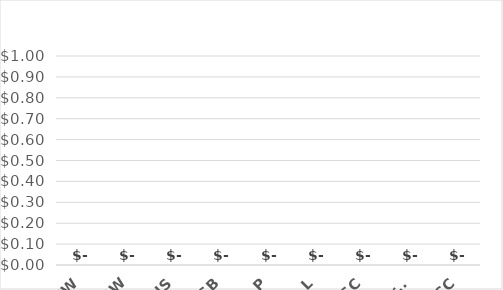
| Category | Series 0 |
|---|---|
| WW | 0 |
| SWSW | 0 |
| DNS | 0 |
| SB | 0 |
| P | 0 |
| L | 0 |
| SC | 0 |
| Garbs | 0 |
| CC | 0 |